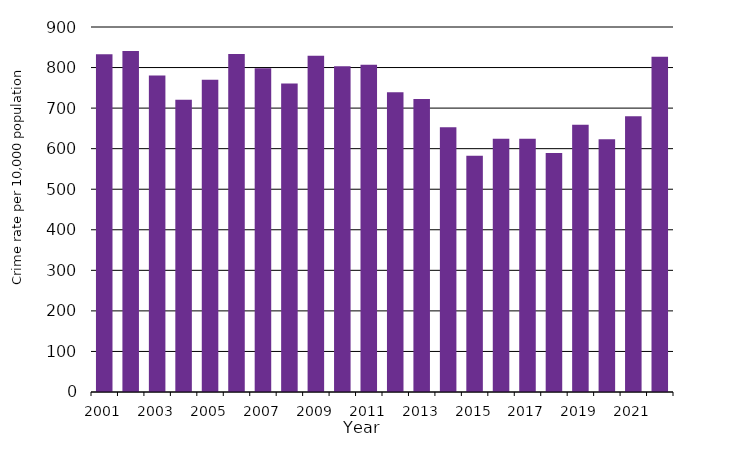
| Category | Crime rate per 10,000 population |
|---|---|
| 2001.0 | 832.57 |
| 2002.0 | 840.779 |
| 2003.0 | 780.644 |
| 2004.0 | 720.709 |
| 2005.0 | 769.962 |
| 2006.0 | 833.719 |
| 2007.0 | 798.031 |
| 2008.0 | 760.705 |
| 2009.0 | 829.013 |
| 2010.0 | 803.07 |
| 2011.0 | 807.107 |
| 2012.0 | 739.154 |
| 2013.0 | 722.412 |
| 2014.0 | 652.733 |
| 2015.0 | 582.691 |
| 2016.0 | 624.713 |
| 2017.0 | 624.52 |
| 2018.0 | 589.03 |
| 2019.0 | 658.702 |
| 2020.0 | 623.331 |
| 2021.0 | 679.721 |
| 2022.0 | 826.786 |